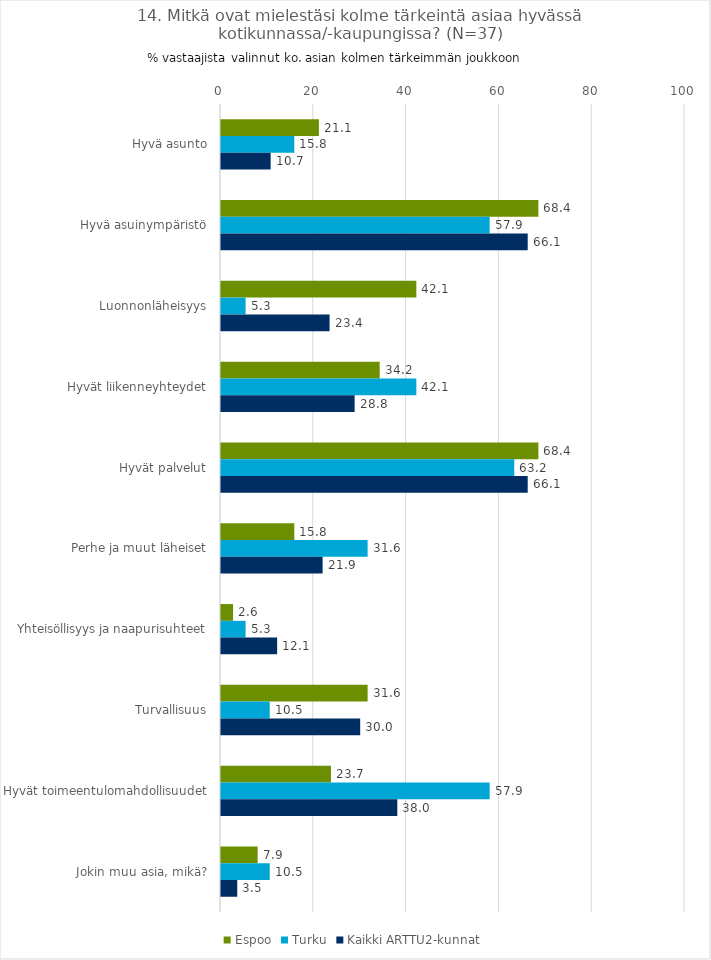
| Category | Espoo | Turku | Kaikki ARTTU2-kunnat |
|---|---|---|---|
| Hyvä asunto | 21.1 | 15.8 | 10.7 |
| Hyvä asuinympäristö | 68.4 | 57.9 | 66.1 |
| Luonnonläheisyys | 42.1 | 5.3 | 23.4 |
| Hyvät liikenneyhteydet | 34.2 | 42.1 | 28.8 |
| Hyvät palvelut | 68.4 | 63.2 | 66.1 |
| Perhe ja muut läheiset | 15.8 | 31.6 | 21.9 |
| Yhteisöllisyys ja naapurisuhteet | 2.6 | 5.3 | 12.1 |
| Turvallisuus | 31.6 | 10.5 | 30 |
| Hyvät toimeentulomahdollisuudet | 23.7 | 57.9 | 38 |
| Jokin muu asia, mikä? | 7.9 | 10.5 | 3.5 |